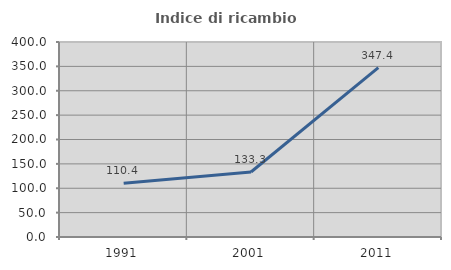
| Category | Indice di ricambio occupazionale  |
|---|---|
| 1991.0 | 110.417 |
| 2001.0 | 133.333 |
| 2011.0 | 347.368 |